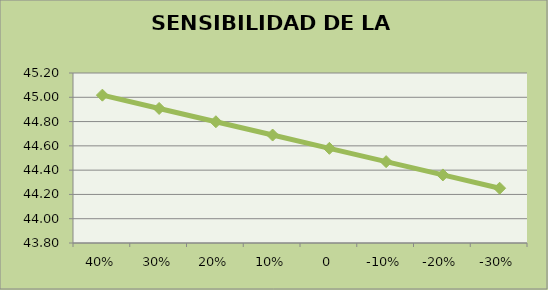
| Category | #¡REF! |
|---|---|
| 0.4 | 45.018 |
| 0.3 | 44.908 |
| 0.2 | 44.799 |
| 0.1 | 44.689 |
| 0.0 | 44.58 |
| -0.1 | 44.47 |
| -0.2 | 44.361 |
| -0.3 | 44.251 |